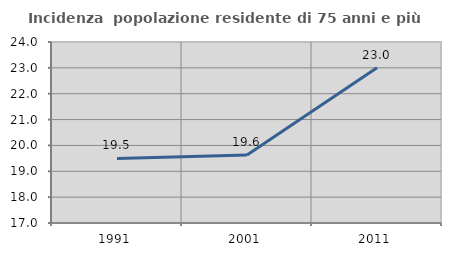
| Category | Incidenza  popolazione residente di 75 anni e più |
|---|---|
| 1991.0 | 19.497 |
| 2001.0 | 19.629 |
| 2011.0 | 23.003 |